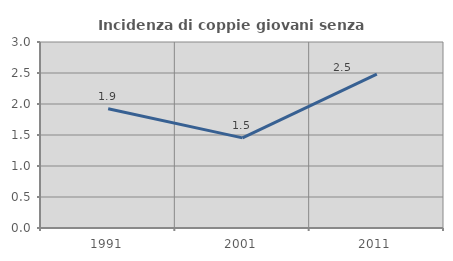
| Category | Incidenza di coppie giovani senza figli |
|---|---|
| 1991.0 | 1.923 |
| 2001.0 | 1.453 |
| 2011.0 | 2.482 |